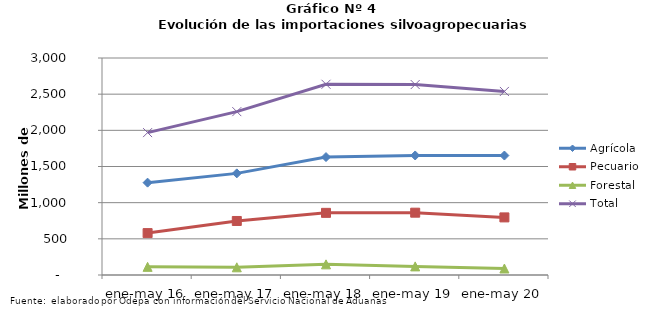
| Category | Agrícola | Pecuario | Forestal | Total |
|---|---|---|---|---|
| ene-may 16 | 1276703 | 579341 | 112607 | 1968651 |
| ene-may 17 | 1405060 | 746972 | 106491 | 2258523 |
| ene-may 18 | 1630310 | 859152 | 147250 | 2636712 |
| ene-may 19 | 1652678 | 861574 | 118838 | 2633090 |
| ene-may 20 | 1651504 | 796232 | 89784 | 2537520 |